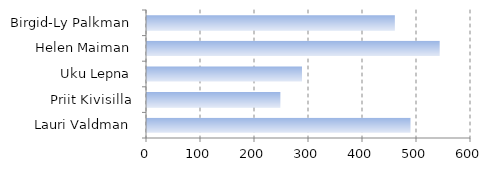
| Category | Series 0 |
|---|---|
| Lauri Valdman | 488 |
| Priit Kivisilla | 247 |
| Uku Lepna | 287 |
| Helen Maiman | 542 |
| Birgid-Ly Palkman | 459 |